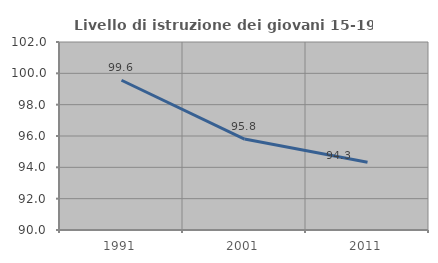
| Category | Livello di istruzione dei giovani 15-19 anni |
|---|---|
| 1991.0 | 99.558 |
| 2001.0 | 95.804 |
| 2011.0 | 94.318 |